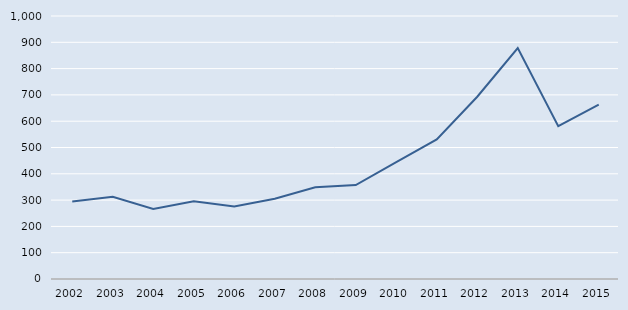
| Category | Series 0 |
|---|---|
| 2002.0 | 295 |
| 2003.0 | 313 |
| 2004.0 | 266 |
| 2005.0 | 296 |
| 2006.0 | 276 |
| 2007.0 | 305 |
| 2008.0 | 349 |
| 2009.0 | 357 |
| 2010.0 | 444 |
| 2011.0 | 531 |
| 2012.0 | 693 |
| 2013.0 | 878 |
| 2014.0 | 581 |
| 2015.0 | 663 |